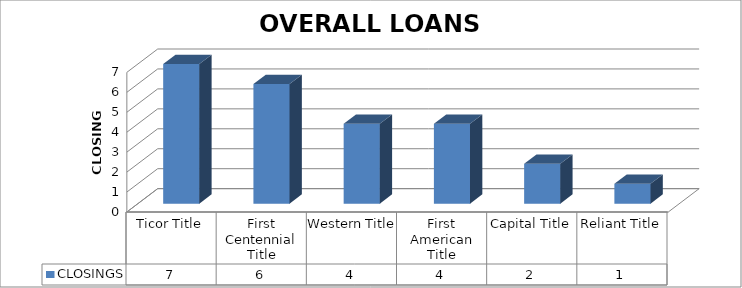
| Category | CLOSINGS |
|---|---|
| Ticor Title | 7 |
| First Centennial Title | 6 |
| Western Title | 4 |
| First American Title | 4 |
| Capital Title | 2 |
| Reliant Title | 1 |